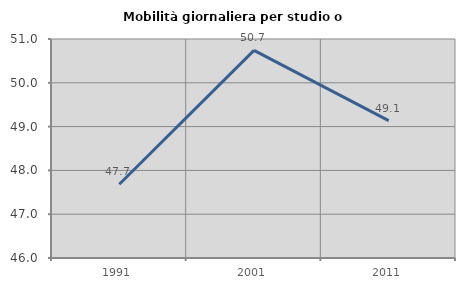
| Category | Mobilità giornaliera per studio o lavoro |
|---|---|
| 1991.0 | 47.684 |
| 2001.0 | 50.741 |
| 2011.0 | 49.135 |